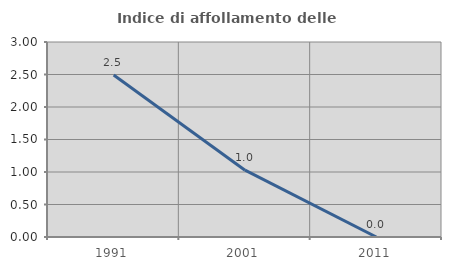
| Category | Indice di affollamento delle abitazioni  |
|---|---|
| 1991.0 | 2.493 |
| 2001.0 | 1.028 |
| 2011.0 | 0 |